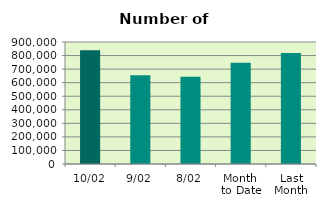
| Category | Series 0 |
|---|---|
| 10/02 | 839592 |
| 9/02 | 655208 |
| 8/02 | 644564 |
| Month 
to Date | 746408 |
| Last
Month | 819236.4 |